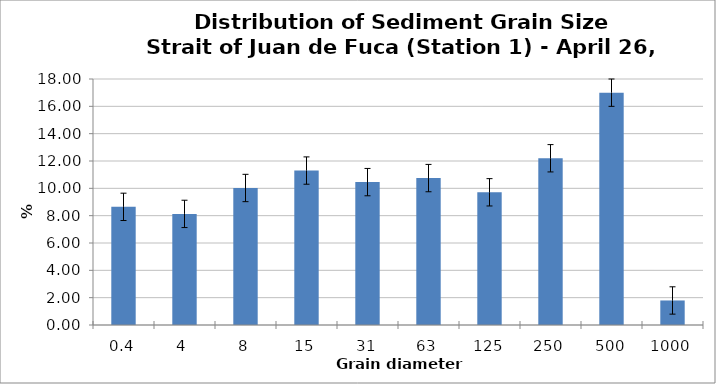
| Category | 1 |
|---|---|
| 0.4 | 8.645 |
| 4.0 | 8.13 |
| 8.0 | 10.025 |
| 15.0 | 11.3 |
| 31.0 | 10.455 |
| 63.0 | 10.75 |
| 125.0 | 9.71 |
| 250.0 | 12.2 |
| 500.0 | 17 |
| 1000.0 | 1.795 |